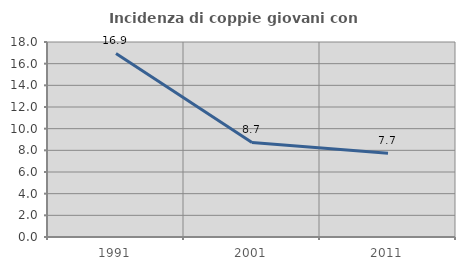
| Category | Incidenza di coppie giovani con figli |
|---|---|
| 1991.0 | 16.949 |
| 2001.0 | 8.729 |
| 2011.0 | 7.727 |